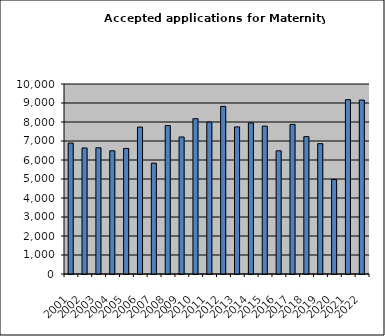
| Category | Series 1 |
|---|---|
| 2001.0 | 6892 |
| 2002.0 | 6634 |
| 2003.0 | 6643 |
| 2004.0 | 6483 |
| 2005.0 | 6609 |
| 2006.0 | 7733 |
| 2007.0 | 5834 |
| 2008.0 | 7811 |
| 2009.0 | 7211 |
| 2010.0 | 8174 |
| 2011.0 | 7997 |
| 2012.0 | 8823 |
| 2013.0 | 7742 |
| 2014.0 | 7949 |
| 2015.0 | 7784 |
| 2016.0 | 6486 |
| 2017.0 | 7873 |
| 2018.0 | 7229 |
| 2019.0 | 6860 |
| 2020.0 | 4976 |
| 2021.0 | 9174 |
| 2022.0 | 9154 |